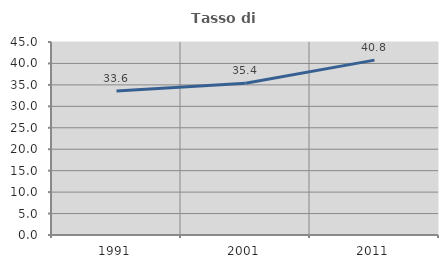
| Category | Tasso di occupazione   |
|---|---|
| 1991.0 | 33.59 |
| 2001.0 | 35.37 |
| 2011.0 | 40.773 |